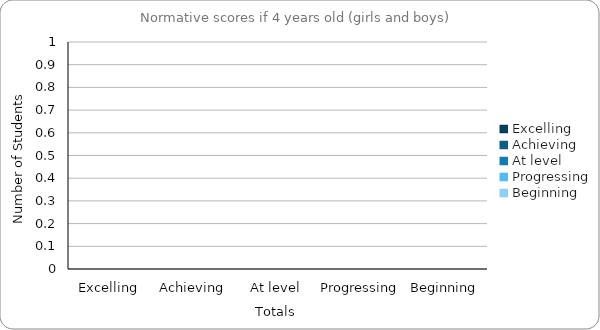
| Category | If 4 years old |
|---|---|
| Excelling | 0 |
| Achieving | 0 |
| At level | 0 |
| Progressing | 0 |
| Beginning | 0 |